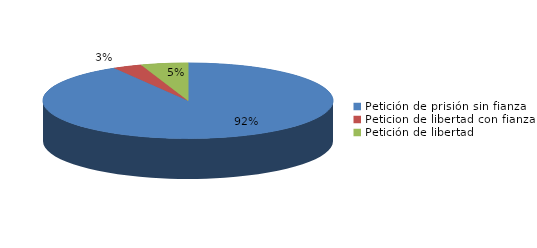
| Category | Series 0 |
|---|---|
| Petición de prisión sin fianza | 227 |
| Peticion de libertad con fianza | 8 |
| Petición de libertad | 13 |